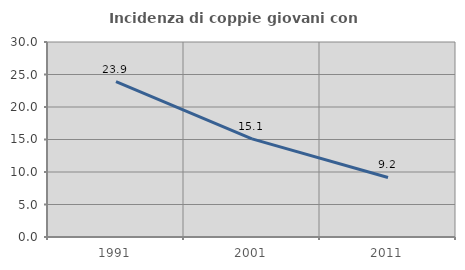
| Category | Incidenza di coppie giovani con figli |
|---|---|
| 1991.0 | 23.888 |
| 2001.0 | 15.094 |
| 2011.0 | 9.156 |